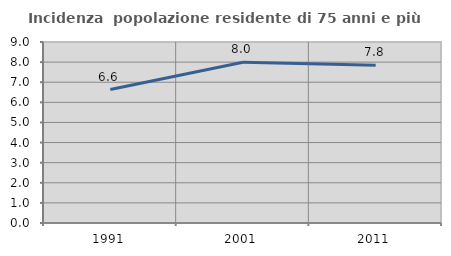
| Category | Incidenza  popolazione residente di 75 anni e più |
|---|---|
| 1991.0 | 6.637 |
| 2001.0 | 7.989 |
| 2011.0 | 7.848 |